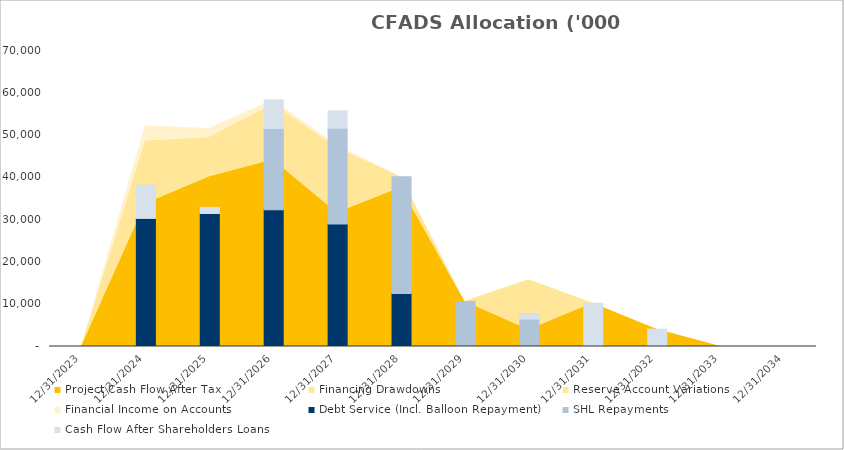
| Category | Debt Service (Incl. Balloon Repayment) | SHL Repayments | Cash Flow After Shareholders Loans |
|---|---|---|---|
| 0 | 0 | 0 | 0 |
| 1/1/00 | 30293.08 | 0 | 7853.471 |
| 1/2/00 | 31447.921 | 0 | 1461.149 |
| 1/3/00 | 32360.448 | 19208.196 | 6748.992 |
| 1/4/00 | 28972.662 | 22646 | 4110.863 |
| 1/5/00 | 12519.823 | 27636.45 | 0 |
| 1/6/00 | 0 | 10648.968 | 0 |
| 1/7/00 | 0 | 6483.834 | 1332.139 |
| 1/8/00 | 0 | 0 | 10251.847 |
| 1/9/00 | 0 | 0 | 4100.739 |
| 1/10/00 | 0 | 0 | 0 |
| 1/11/00 | 0 | 0 | 0 |
| 1/12/00 | 0 | 0 | 0 |
| 1/13/00 | 0 | 0 | 0 |
| 1/14/00 | 0 | 0 | 0 |
| 1/15/00 | 0 | 0 | 0 |
| 1/16/00 | 0 | 0 | 0 |
| 1/17/00 | 0 | 0 | 0 |
| 1/18/00 | 0 | 0 | 0 |
| 1/19/00 | 0 | 0 | 0 |
| 1/20/00 | 0 | 0 | 0 |
| 1/21/00 | 0 | 0 | 0 |
| 1/22/00 | 0 | 0 | 0 |
| 1/23/00 | 0 | 0 | 0 |
| 1/24/00 | 0 | 0 | 0 |
| 1/25/00 | 0 | 0 | 0 |
| 1/26/00 | 0 | 0 | 0 |
| 1/27/00 | 0 | 0 | 0 |
| 1/28/00 | 0 | 0 | 0 |
| 1/29/00 | 0 | 0 | 0 |
| 1/30/00 | 0 | 0 | 0 |
| 1/31/00 | 0 | 0 | 0 |
| 2/1/00 | 0 | 0 | 0 |
| 2/2/00 | 0 | 0 | 0 |
| 2/3/00 | 0 | 0 | 0 |
| 2/4/00 | 0 | 0 | 0 |
| 2/5/00 | 0 | 0 | 0 |
| 2/6/00 | 0 | 0 | 0 |
| 2/7/00 | 0 | 0 | 0 |
| 2/8/00 | 0 | 0 | 0 |
| 2/9/00 | 0 | 0 | 0 |
| 2/10/00 | 0 | 0 | 0 |
| 2/11/00 | 0 | 0 | 0 |
| 2/12/00 | 0 | 0 | 0 |
| 2/13/00 | 0 | 0 | 0 |
| 2/14/00 | 0 | 0 | 0 |
| 2/15/00 | 0 | 0 | 0 |
| 2/16/00 | 0 | 0 | 0 |
| 2/17/00 | 0 | 0 | 0 |
| 2/18/00 | 0 | 0 | 0 |
| 2/19/00 | 0 | 0 | 0 |
| 2/20/00 | 0 | 0 | 0 |
| 2/21/00 | 0 | 0 | 0 |
| 2/22/00 | 0 | 0 | 0 |
| 2/23/00 | 0 | 0 | 0 |
| 2/24/00 | 0 | 0 | 0 |
| 2/25/00 | 0 | 0 | 0 |
| 2/26/00 | 0 | 0 | 0 |
| 2/27/00 | 0 | 0 | 0 |
| 2/28/00 | 0 | 0 | 0 |